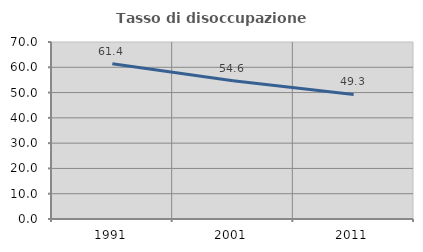
| Category | Tasso di disoccupazione giovanile  |
|---|---|
| 1991.0 | 61.364 |
| 2001.0 | 54.638 |
| 2011.0 | 49.254 |